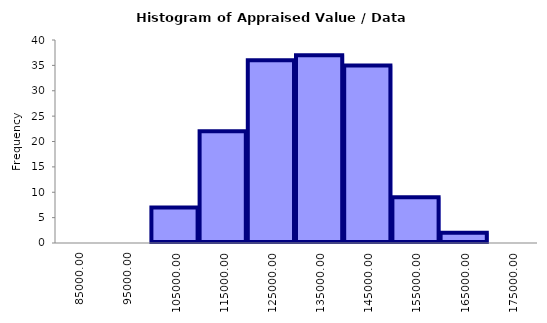
| Category | Series 0 |
|---|---|
| 85000.0 | 0 |
| 95000.0 | 0 |
| 105000.0 | 7 |
| 115000.0 | 22 |
| 125000.0 | 36 |
| 135000.0 | 37 |
| 145000.0 | 35 |
| 155000.0 | 9 |
| 165000.0 | 2 |
| 175000.0 | 0 |